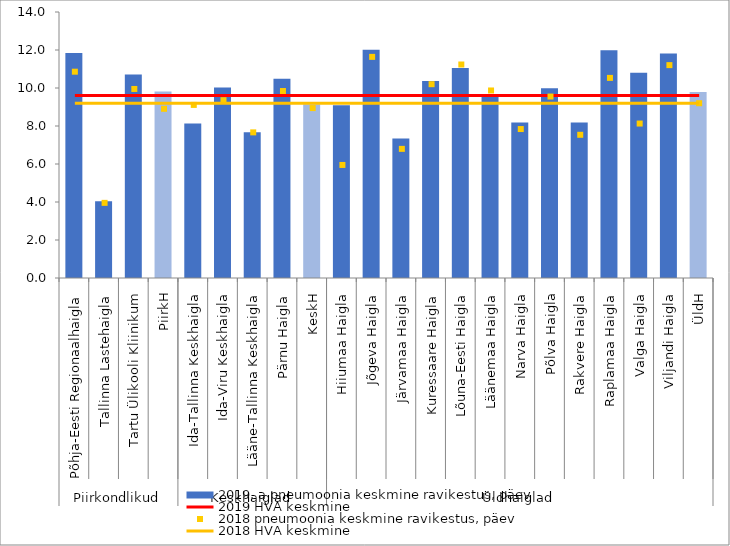
| Category | 2019. a pneumoonia keskmine ravikestus, päev |
|---|---|
| 0 | 11.846 |
| 1 | 4.036 |
| 2 | 10.706 |
| 3 | 9.818 |
| 4 | 8.136 |
| 5 | 10.028 |
| 6 | 7.677 |
| 7 | 10.486 |
| 8 | 9.14 |
| 9 | 9.086 |
| 10 | 12.013 |
| 11 | 7.337 |
| 12 | 10.374 |
| 13 | 11.057 |
| 14 | 9.593 |
| 15 | 8.19 |
| 16 | 9.988 |
| 17 | 8.188 |
| 18 | 11.988 |
| 19 | 10.809 |
| 20 | 11.811 |
| 21 | 9.787 |